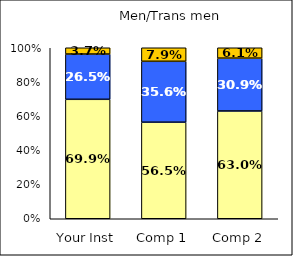
| Category | Low Institutional Priority: Increase Prestige | Average Institutional Priority: Increase Prestige | High Institutional Priority: Increase Prestige |
|---|---|---|---|
| Your Inst | 0.699 | 0.265 | 0.037 |
| Comp 1 | 0.565 | 0.356 | 0.079 |
| Comp 2 | 0.63 | 0.309 | 0.061 |